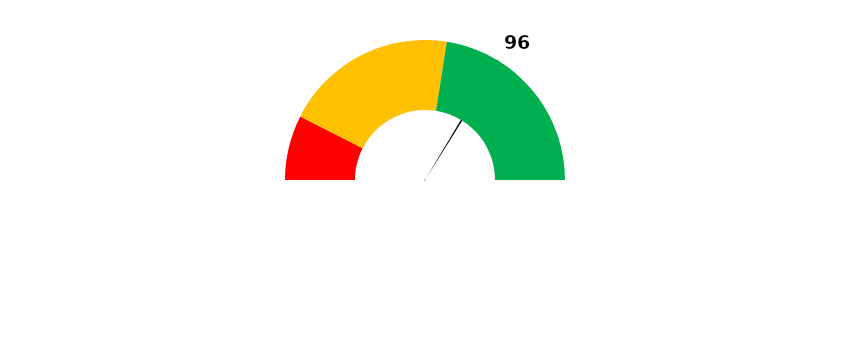
| Category | İbre |
|---|---|
| 0 | 96 |
| 1 | 1 |
| 2 | 189 |